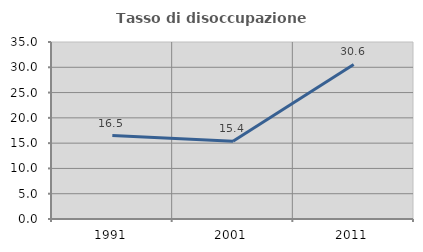
| Category | Tasso di disoccupazione giovanile  |
|---|---|
| 1991.0 | 16.505 |
| 2001.0 | 15.385 |
| 2011.0 | 30.556 |